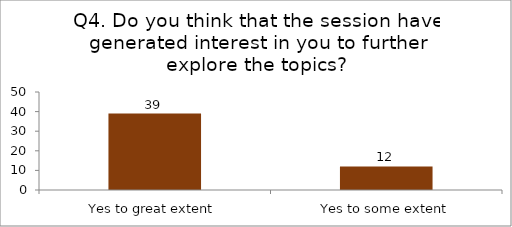
| Category | Q4. Do you think that the session have generated interest in you to further explore the topics? |
|---|---|
| Yes to great extent | 39 |
| Yes to some extent | 12 |